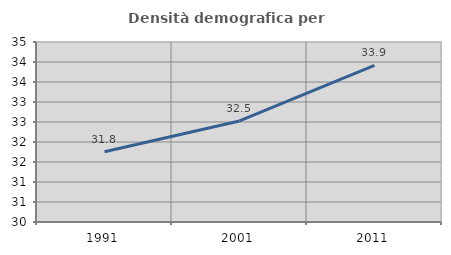
| Category | Densità demografica |
|---|---|
| 1991.0 | 31.755 |
| 2001.0 | 32.526 |
| 2011.0 | 33.913 |